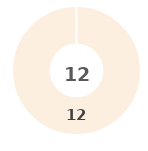
| Category | Series 0 |
|---|---|
| 0 | 0 |
| 1 | 0 |
| 2 | 0 |
| 3 | 0 |
| 4 | 12 |